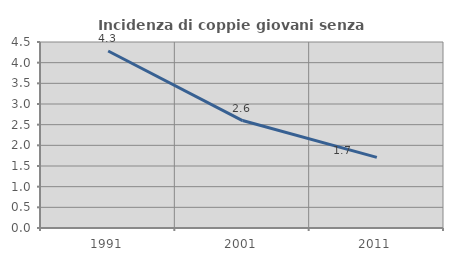
| Category | Incidenza di coppie giovani senza figli |
|---|---|
| 1991.0 | 4.282 |
| 2001.0 | 2.599 |
| 2011.0 | 1.708 |